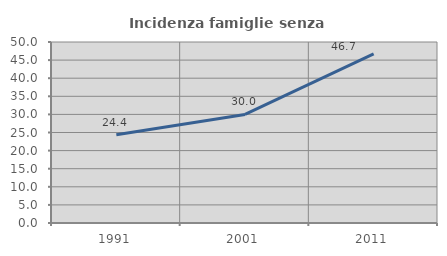
| Category | Incidenza famiglie senza nuclei |
|---|---|
| 1991.0 | 24.356 |
| 2001.0 | 29.991 |
| 2011.0 | 46.696 |